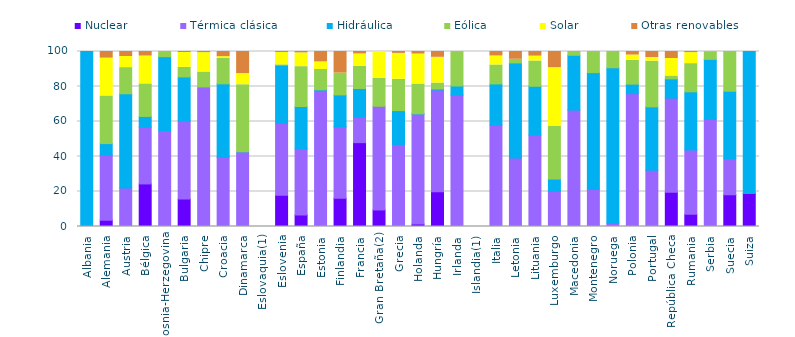
| Category | Nuclear | Térmica clásica | Hidráulica | Eólica | Solar | Otras renovables |
|---|---|---|---|---|---|---|
| Albania | 0 | 0 | 100 | 0 | 0 | 0 |
| Alemania | 3.639 | 37.148 | 6.588 | 27.218 | 21.62 | 3.786 |
| Austria | 0 | 22.009 | 53.83 | 14.951 | 6.361 | 2.849 |
| Bélgica | 24.326 | 32.475 | 6.095 | 18.599 | 15.91 | 2.595 |
| Bosnia-Herzegovina | 0 | 54.659 | 42.392 | 2.948 | 0 | 0 |
| Bulgaria | 15.647 | 44.696 | 25.121 | 5.476 | 8.481 | 0.579 |
| Chipre | 0 | 79.763 | 0 | 8.527 | 11.063 | 0.648 |
| Croacia | 0 | 39.514 | 42.021 | 14.47 | 1.038 | 2.957 |
| Dinamarca | 0 | 42.641 | 0.044 | 38.332 | 6.363 | 12.62 |
| Eslovaquia(1) | 0 | 0 | 0 | 0 | 0 | 0 |
| Eslovenia | 17.846 | 41.256 | 33.103 | 0.077 | 7.128 | 0.59 |
| España | 6.627 | 37.799 | 24.154 | 22.764 | 7.883 | 0.773 |
| Estonia | 0 | 77.837 | 0.282 | 11.593 | 4.334 | 5.955 |
| Finlandia | 16.175 | 40.79 | 18.224 | 12.418 | 0.041 | 12.354 |
| Francia | 47.918 | 14.542 | 16.397 | 12.594 | 7.164 | 1.384 |
| Gran Bretaña(2) | 9.445 | 59.262 | 0 | 15.912 | 15.381 | 0 |
| Grecia | 0 | 46.915 | 19.307 | 17.9 | 14.794 | 1.084 |
| Holanda | 1.454 | 62.807 | 0.114 | 17.036 | 17.12 | 1.469 |
| Hungría | 19.858 | 58.12 | 0.607 | 3.378 | 14.713 | 3.325 |
| Irlanda | 0 | 75.13 | 5.169 | 19.528 | 0 | 0.173 |
| Islandia(1) | 0 | 0 | 0 | 0 | 0 | 0 |
| Italia | 0 | 58.046 | 23.44 | 10.807 | 5.152 | 2.556 |
| Letonia | 0 | 39.167 | 54.305 | 2.082 | 0 | 4.446 |
| Lituania | 0 | 52.338 | 27.791 | 14.436 | 2.785 | 2.649 |
| Luxemburgo | 0 | 20.039 | 7.073 | 30.255 | 33.399 | 9.234 |
| Macedonia | 0 | 66.522 | 31.312 | 2.166 | 0 | 0 |
| Montenegro | 0 | 21.494 | 66.428 | 12.078 | 0 | 0 |
| Noruega | 0 | 1.943 | 88.773 | 9.285 | 0 | 0 |
| Polonia | 0 | 75.887 | 5.462 | 13.634 | 3 | 2.015 |
| Portugal | 0 | 32.113 | 36.262 | 26.119 | 2.082 | 3.423 |
| República Checa | 19.635 | 53.733 | 10.984 | 1.648 | 10.017 | 3.985 |
| Rumania | 7.042 | 36.666 | 33.259 | 16.099 | 6.3 | 0.634 |
| Serbia | 0 | 61.344 | 34.17 | 4.354 | 0.044 | 0.088 |
| Suecia | 18.14 | 20.768 | 38.393 | 22.7 | 0 | 0 |
| Suiza | 18.927 | 0 | 81.073 | 0 | 0 | 0 |